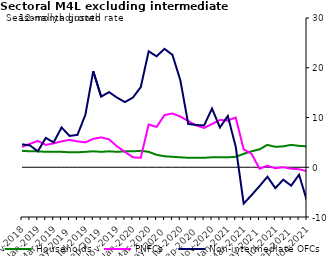
| Category | zero | Households | PNFCs | Non-intermediate OFCs |
|---|---|---|---|---|
| Nov-2018 | 0 | 3.3 | 4.1 | 4.6 |
| Dec-2018 | 0 | 3.2 | 4.7 | 4.4 |
| Jan-2019 | 0 | 3.2 | 5.3 | 3.2 |
| Feb-2019 | 0 | 3.1 | 4.5 | 5.9 |
| Mar-2019 | 0 | 3.1 | 4.8 | 5 |
| Apr-2019 | 0 | 3.1 | 5.2 | 8 |
| May-2019 | 0 | 3 | 5.5 | 6.3 |
| Jun-2019 | 0 | 3 | 5.2 | 6.5 |
| Jul-2019 | 0 | 3.1 | 5 | 10.5 |
| Aug-2019 | 0 | 3.2 | 5.7 | 19.3 |
| Sep-2019 | 0 | 3.1 | 6 | 14.2 |
| Oct-2019 | 0 | 3.2 | 5.6 | 15.1 |
| Nov-2019 | 0 | 3.1 | 4.2 | 14 |
| Dec-2019 | 0 | 3.2 | 3.1 | 13.1 |
| Jan-2020 | 0 | 3.2 | 2 | 14 |
| Feb-2020 | 0 | 3.3 | 1.9 | 16.1 |
| Mar-2020 | 0 | 3.1 | 8.6 | 23.3 |
| Apr-2020 | 0 | 2.5 | 8.1 | 22.3 |
| May-2020 | 0 | 2.2 | 10.5 | 23.8 |
| Jun-2020 | 0 | 2.1 | 10.8 | 22.6 |
| Jul-2020 | 0 | 2 | 10.2 | 17.5 |
| Aug-2020 | 0 | 1.9 | 9.3 | 8.7 |
| Sep-2020 | 0 | 1.9 | 8.4 | 8.5 |
| Oct-2020 | 0 | 1.9 | 7.9 | 8.4 |
| Nov-2020 | 0 | 2 | 8.7 | 11.8 |
| Dec-2020 | 0 | 2 | 9.5 | 8 |
| Jan-2021 | 0 | 2 | 9.4 | 10.3 |
| Feb-2021 | 0 | 2.1 | 10 | 4.1 |
| Mar-2021 | 0 | 2.7 | 3.6 | -7.3 |
| Apr-2021 | 0 | 3.2 | 2.7 | -5.6 |
| May-2021 | 0 | 3.6 | -0.3 | -3.8 |
| Jun-2021 | 0 | 4.5 | 0.3 | -1.9 |
| Jul-2021 | 0 | 4.1 | -0.2 | -4.2 |
| Aug-2021 | 0 | 4.2 | 0 | -2.5 |
| Sep-2021 | 0 | 4.5 | -0.3 | -3.7 |
| Oct-2021 | 0 | 4.3 | -0.4 | -1.5 |
| Nov-2021 | 0 | 4.2 | -0.8 | -6.8 |